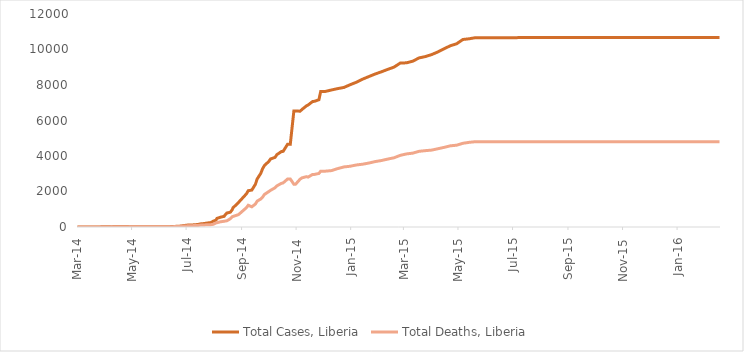
| Category | Total Cases, Liberia | Total Deaths, Liberia |
|---|---|---|
| 2014-03-01 | 0 | 0 |
| 2014-03-02 | 0 | 0 |
| 2014-03-03 | 0 | 0 |
| 2014-03-04 | 0 | 0 |
| 2014-03-05 | 0 | 0 |
| 2014-03-06 | 0 | 0 |
| 2014-03-07 | 0 | 0 |
| 2014-03-08 | 0 | 0 |
| 2014-03-09 | 0 | 0 |
| 2014-03-10 | 0 | 0 |
| 2014-03-11 | 0 | 0 |
| 2014-03-12 | 0 | 0 |
| 2014-03-13 | 0 | 0 |
| 2014-03-14 | 0 | 0 |
| 2014-03-15 | 0 | 0 |
| 2014-03-16 | 0 | 0 |
| 2014-03-17 | 0 | 0 |
| 2014-03-18 | 0 | 0 |
| 2014-03-19 | 0 | 0 |
| 2014-03-20 | 0 | 0 |
| 2014-03-21 | 0 | 0 |
| 2014-03-22 | 0 | 0 |
| 2014-03-23 | 0 | 0 |
| 2014-03-24 | 0 | 0 |
| 2014-03-25 | 0 | 0 |
| 2014-03-26 | 0 | 0 |
| 2014-03-27 | 8 | 6 |
| 2014-03-31 | 8 | 6 |
| 2014-04-01 | 8 | 2 |
| 2014-04-02 | 8 | 5 |
| 2014-04-07 | 18 | 7 |
| 2014-04-10 | 22 | 14 |
| 2014-04-17 | 27 | 13 |
| 2014-04-21 | 27 | 13 |
| 2014-04-23 | 34 | 11 |
| 2014-04-30 | 13 | 11 |
| 2014-05-05 | 13 | 11 |
| 2014-05-14 | 12 | 11 |
| 2014-05-23 | 12 | 9 |
| 2014-05-27 | 12 | 9 |
| 2014-05-28 | 12 | 9 |
| 2014-06-02 | 13 | 9 |
| 2014-06-05 | 13 | 9 |
| 2014-06-10 | 15 | 10 |
| 2014-06-11 | 15 | 10 |
| 2014-06-18 | 33 | 24 |
| 2014-06-24 | 51 | 34 |
| 2014-07-02 | 107 | 65 |
| 2014-07-07 | 115 | 75 |
| 2014-07-08 | 131 | 84 |
| 2014-07-14 | 142 | 88 |
| 2014-07-16 | 172 | 105 |
| 2014-07-21 | 196 | 116 |
| 2014-07-24 | 224 | 127 |
| 2014-07-28 | 249 | 129 |
| 2014-07-31 | 329 | 156 |
| 2014-08-03 | 391 | 227 |
| 2014-08-04 | 486 | 255 |
| 2014-08-08 | 554 | 294 |
| 2014-08-12 | 599 | 323 |
| 2014-08-13 | 670 | 355 |
| 2014-08-15 | 786 | 348 |
| 2014-08-19 | 834 | 466 |
| 2014-08-21 | 972 | 576 |
| 2014-08-22 | 1082 | 624 |
| 2014-08-28 | 1378 | 694 |
| 2014-09-06 | 1871 | 1089 |
| 2014-09-08 | 2046 | 1224 |
| 2014-09-12 | 2081 | 1137 |
| 2014-09-16 | 2407 | 1296 |
| 2014-09-18 | 2710 | 1459 |
| 2014-09-22 | 3022 | 1578 |
| 2014-09-24 | 3280 | 1677 |
| 2014-09-26 | 3458 | 1830 |
| 2014-10-01 | 3696 | 1998 |
| 2014-10-03 | 3834 | 2069 |
| 2014-10-08 | 3924 | 2210 |
| 2014-10-10 | 4076 | 2316 |
| 2014-10-15 | 4249 | 2458 |
| 2014-10-17 | 4262 | 2484 |
| 2014-10-22 | 4665 | 2705 |
| 2014-10-25 | 4665 | 2705 |
| 2014-10-29 | 6535 | 2413 |
| 2014-10-31 | 6535 | 2413 |
| 2014-11-05 | 6525 | 2697 |
| 2014-11-07 | 6619 | 2766 |
| 2014-11-12 | 6822 | 2836 |
| 2014-11-14 | 6878 | 2812 |
| 2014-11-19 | 7069 | 2964 |
| 2014-11-21 | 7082 | 2963 |
| 2014-11-26 | 7168 | 3016 |
| 2014-11-28 | 7635 | 3145 |
| 2014-12-03 | 7635 | 3145 |
| 2014-12-10 | 7719 | 3177 |
| 2014-12-17 | 7797 | 3290 |
| 2014-12-24 | 7862 | 3384 |
| 2014-12-31 | 8018 | 3423 |
| 2015-01-07 | 8157 | 3496 |
| 2015-01-14 | 8331 | 3538 |
| 2015-01-21 | 8478 | 3605 |
| 2015-01-28 | 8622 | 3686 |
| 2015-02-04 | 8745 | 3746 |
| 2015-02-11 | 8881 | 3826 |
| 2015-02-18 | 9007 | 3900 |
| 2015-02-25 | 9238 | 4037 |
| 2015-03-04 | 9249 | 4117 |
| 2015-03-11 | 9343 | 4162 |
| 2015-03-18 | 9526 | 4264 |
| 2015-03-25 | 9602 | 4301 |
| 2015-04-01 | 9712 | 4332 |
| 2015-04-08 | 9862 | 4408 |
| 2015-04-15 | 10042 | 4486 |
| 2015-04-22 | 10212 | 4573 |
| 2015-04-29 | 10322 | 4608 |
| 2015-05-06 | 10564 | 4716 |
| 2015-05-13 | 10604 | 4769 |
| 2015-05-20 | 10666 | 4806 |
| 2015-05-27 | 10666 | 4806 |
| 2015-06-03 | 10666 | 4806 |
| 2015-06-10 | 10666 | 4806 |
| 2015-06-17 | 10666 | 4806 |
| 2015-06-24 | 10666 | 4806 |
| 2015-07-01 | 10666 | 4806 |
| 2015-07-08 | 10670 | 4807 |
| 2015-07-15 | 10673 | 4808 |
| 2015-07-22 | 10672 | 4808 |
| 2015-07-29 | 10672 | 4808 |
| 2015-08-05 | 10672 | 4808 |
| 2015-08-12 | 10672 | 4808 |
| 2015-08-19 | 10672 | 4808 |
| 2015-08-27 | 10672 | 4808 |
| 2015-09-03 | 10672 | 4808 |
| 2015-09-10 | 10672 | 4808 |
| 2015-09-17 | 10672 | 4808 |
| 2015-09-24 | 10672 | 4808 |
| 2015-10-01 | 10672 | 4808 |
| 2015-10-08 | 10672 | 4808 |
| 2015-10-15 | 10672 | 4808 |
| 2015-10-22 | 10672 | 4808 |
| 2015-10-29 | 10672 | 4808 |
| 2015-11-05 | 10672 | 4808 |
| 2015-11-11 | 10672 | 4808 |
| 2015-11-18 | 10672 | 4808 |
| 2015-11-25 | 10675 | 4808 |
| 2015-12-02 | 10675 | 4809 |
| 2015-12-09 | 10675 | 4809 |
| 2015-12-16 | 10675 | 4809 |
| 2015-12-23 | 10675 | 4809 |
| 2015-12-30 | 10675 | 4809 |
| 2016-01-06 | 10675 | 4809 |
| 2016-01-13 | 10675 | 4809 |
| 2016-01-20 | 10675 | 4809 |
| 2016-01-27 | 10675 | 4809 |
| 2016-02-03 | 10675 | 4809 |
| 2016-02-10 | 10675 | 4809 |
| 2016-02-17 | 10675 | 4809 |